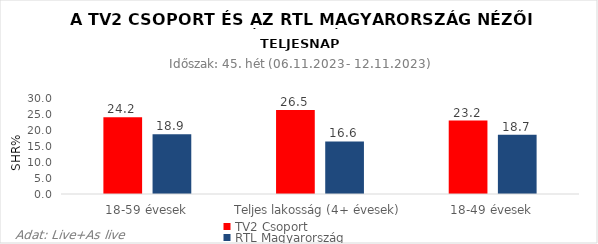
| Category | TV2 Csoport | RTL Magyarország |
|---|---|---|
| 18-59 évesek | 24.2 | 18.9 |
| Teljes lakosság (4+ évesek) | 26.5 | 16.6 |
| 18-49 évesek | 23.2 | 18.7 |